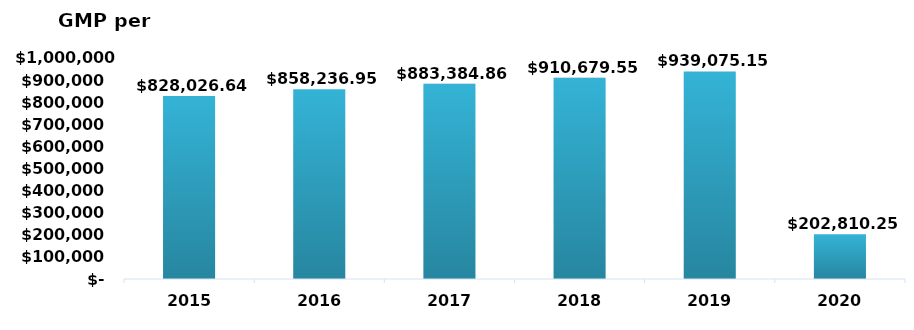
| Category | Total |
|---|---|
| 2015 | 828026638.67 |
| 2016 | 858236950.18 |
| 2017 | 883384864.92 |
| 2018 | 910679549.08 |
| 2019 | 939075153.21 |
| 2020 | 202810254.2 |